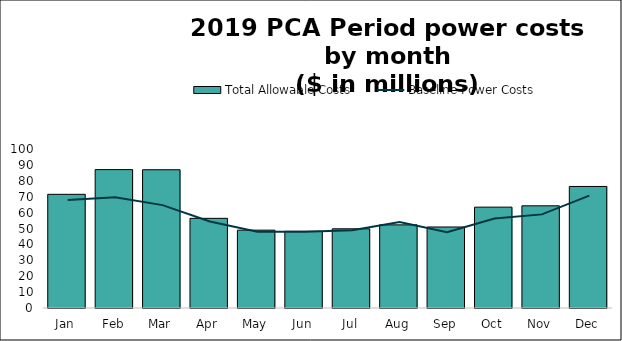
| Category | Total Allowable Costs |
|---|---|
| Jan | 71.496 |
| Feb | 87.03 |
| Mar | 86.958 |
| Apr | 56.388 |
| May | 48.963 |
| Jun | 48.249 |
| Jul | 49.806 |
| Aug | 52.289 |
| Sep | 50.953 |
| Oct | 63.431 |
| Nov | 64.26 |
| Dec | 76.439 |